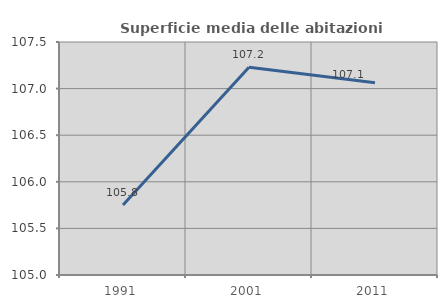
| Category | Superficie media delle abitazioni occupate |
|---|---|
| 1991.0 | 105.752 |
| 2001.0 | 107.228 |
| 2011.0 | 107.062 |